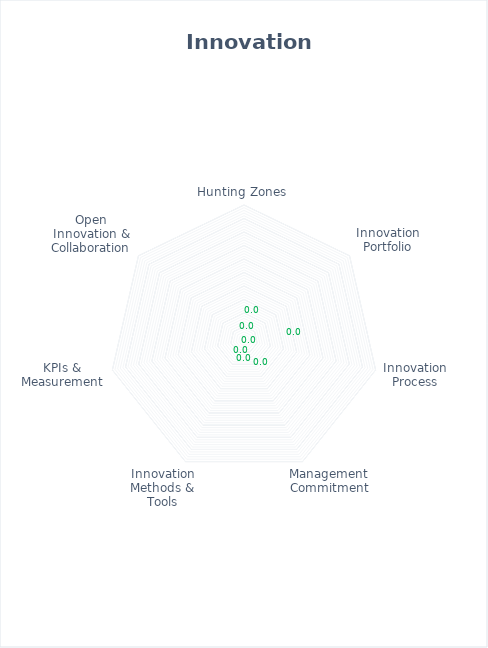
| Category | Series 0 |
|---|---|
| Hunting Zones | 0 |
| Innovation Portfolio | 0 |
| Innovation Process | 0 |
| Management Commitment | 0 |
| Innovation Methods & Tools | 0 |
| KPIs & Measurement | 0 |
| Open Innovation & Collaboration | 0 |